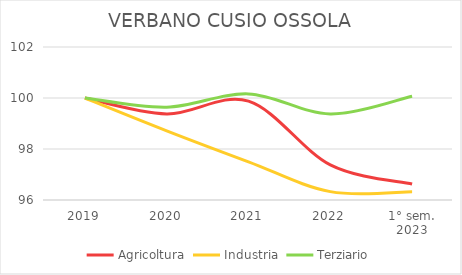
| Category | Agricoltura | Industria | Terziario |
|---|---|---|---|
| 2019 | 100 | 100 | 100 |
| 2020 | 99.375 | 98.714 | 99.638 |
| 2021 | 99.875 | 97.498 | 100.161 |
| 2022 | 97.375 | 96.328 | 99.376 |
| 1° sem.
2023 | 96.625 | 96.328 | 100.07 |